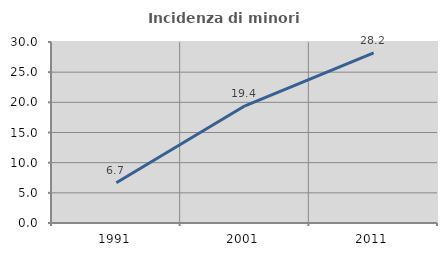
| Category | Incidenza di minori stranieri |
|---|---|
| 1991.0 | 6.667 |
| 2001.0 | 19.427 |
| 2011.0 | 28.197 |